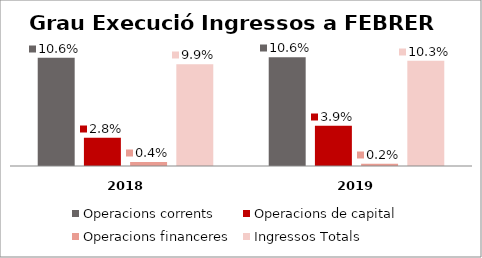
| Category | Operacions corrents | Operacions de capital | Operacions financeres | Ingressos Totals |
|---|---|---|---|---|
| 0 | 0.106 | 0.028 | 0.004 | 0.099 |
| 1 | 0.106 | 0.039 | 0.002 | 0.103 |